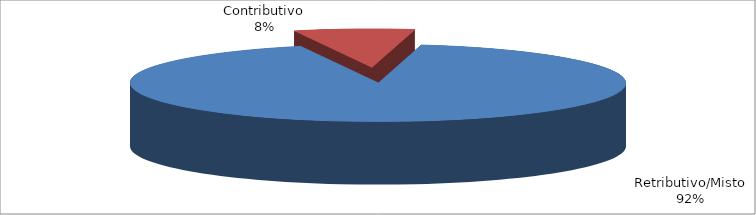
| Category | Decorrenti gennaio - settembre 2022 |
|---|---|
| Retributivo/Misto | 228390 |
| Contributivo | 19408 |